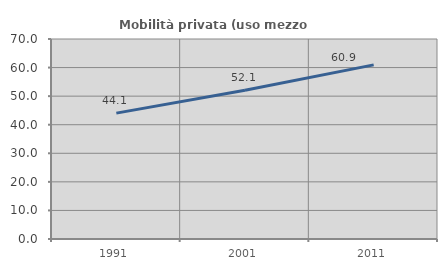
| Category | Mobilità privata (uso mezzo privato) |
|---|---|
| 1991.0 | 44.063 |
| 2001.0 | 52.096 |
| 2011.0 | 60.947 |